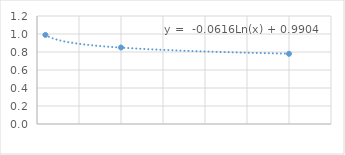
| Category | Series 0 |
|---|---|
| 1.0 | 0.99 |
| 10.0 | 0.85 |
| 30.0 | 0.78 |